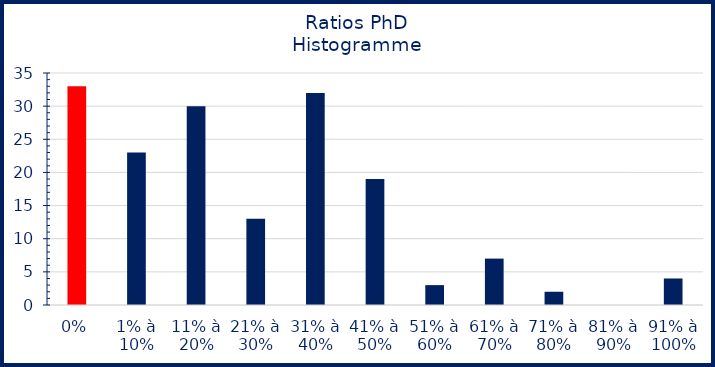
| Category | Series 0 |
|---|---|
| 0% | 33 |
| 1% à 10% | 23 |
| 11% à 20% | 30 |
| 21% à 30% | 13 |
| 31% à 40% | 32 |
| 41% à 50% | 19 |
| 51% à 60% | 3 |
| 61% à 70% | 7 |
| 71% à 80% | 2 |
| 81% à 90% | 0 |
| 91% à 100% | 4 |